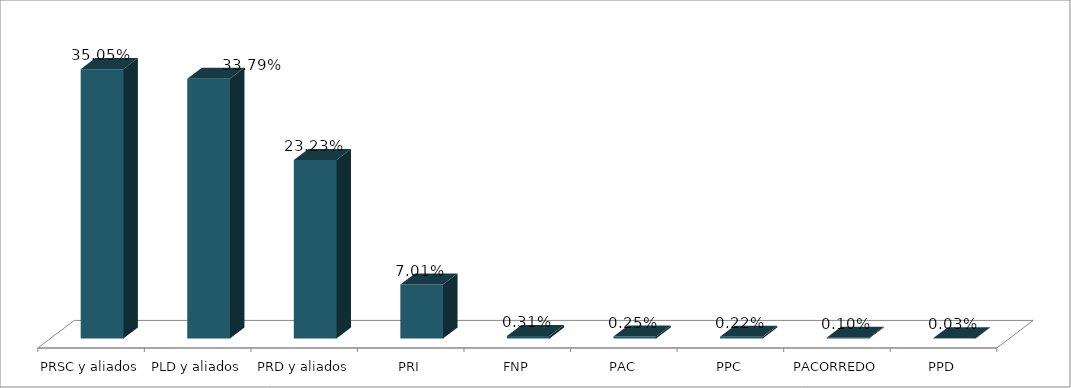
| Category | Votos % |
|---|---|
| PRSC y aliados | 0.351 |
| PLD y aliados | 0.338 |
| PRD y aliados | 0.232 |
| PRI | 0.07 |
| FNP | 0.003 |
| PAC | 0.003 |
| PPC | 0.002 |
| PACORREDO | 0.001 |
| PPD | 0 |